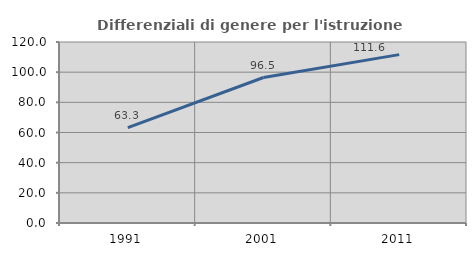
| Category | Differenziali di genere per l'istruzione superiore |
|---|---|
| 1991.0 | 63.271 |
| 2001.0 | 96.46 |
| 2011.0 | 111.639 |